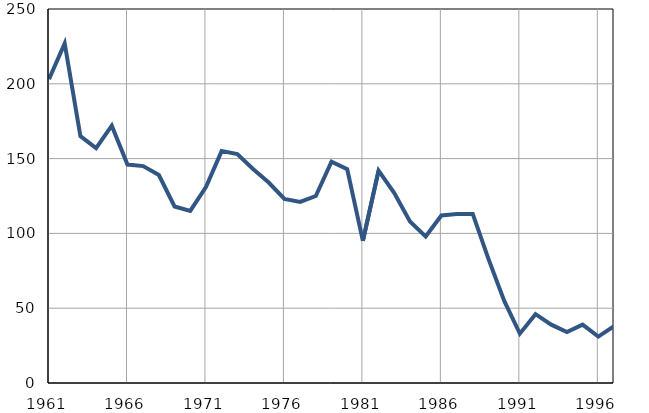
| Category | Умрла 
одојчад |
|---|---|
| 1961.0 | 203 |
| 1962.0 | 227 |
| 1963.0 | 165 |
| 1964.0 | 157 |
| 1965.0 | 172 |
| 1966.0 | 146 |
| 1967.0 | 145 |
| 1968.0 | 139 |
| 1969.0 | 118 |
| 1970.0 | 115 |
| 1971.0 | 131 |
| 1972.0 | 155 |
| 1973.0 | 153 |
| 1974.0 | 143 |
| 1975.0 | 134 |
| 1976.0 | 123 |
| 1977.0 | 121 |
| 1978.0 | 125 |
| 1979.0 | 148 |
| 1980.0 | 143 |
| 1981.0 | 95 |
| 1982.0 | 142 |
| 1983.0 | 127 |
| 1984.0 | 108 |
| 1985.0 | 98 |
| 1986.0 | 112 |
| 1987.0 | 113 |
| 1988.0 | 113 |
| 1989.0 | 83 |
| 1990.0 | 55 |
| 1991.0 | 33 |
| 1992.0 | 46 |
| 1993.0 | 39 |
| 1994.0 | 34 |
| 1995.0 | 39 |
| 1996.0 | 31 |
| 1997.0 | 38 |